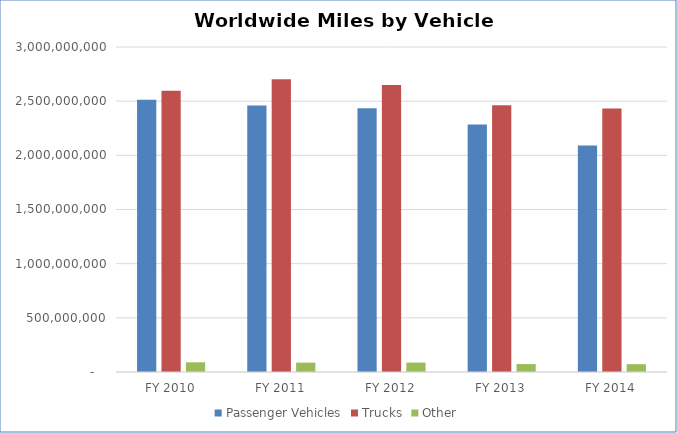
| Category | Passenger Vehicles | Trucks | Other |
|---|---|---|---|
| FY 2010 | 2512744272 | 2595359124 | 89258950 |
| FY 2011 | 2460521232 | 2701454429 | 86279734 |
| FY 2012 | 2435688600 | 2648469559 | 86709179 |
| FY 2013 | 2284132401 | 2462299965 | 73157676 |
| FY 2014 | 2090218702 | 2432920828 | 72103932 |